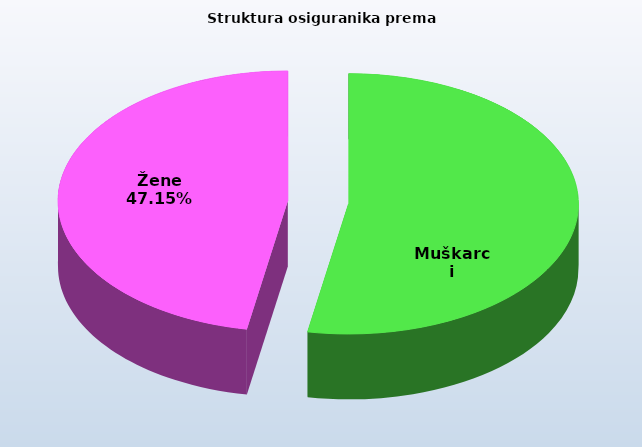
| Category | Series 0 |
|---|---|
| Muškarci | 829169 |
| Žene | 739758 |